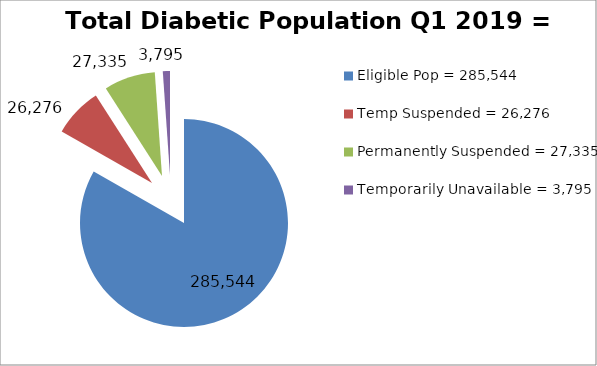
| Category | Total Diabetic Population Q1 2019 = 335,360 |
|---|---|
| Eligible Pop = 285,544 | 285544 |
| Temp Suspended = 26,276 | 26276 |
| Permanently Suspended = 27,335 | 27335 |
| Temporarily Unavailable = 3,795 | 3795 |